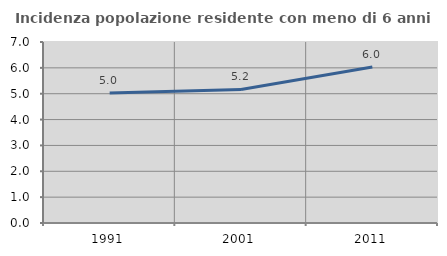
| Category | Incidenza popolazione residente con meno di 6 anni |
|---|---|
| 1991.0 | 5.027 |
| 2001.0 | 5.164 |
| 2011.0 | 6.037 |